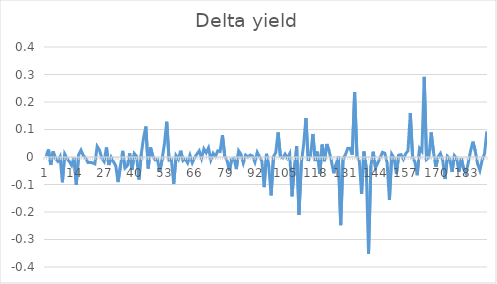
| Category | Series 0 |
|---|---|
| 0 | 0.004 |
| 1900-01-01 | 0.027 |
| 1900-01-02 | -0.029 |
| 1900-01-03 | 0.02 |
| 1900-01-04 | -0.005 |
| 1900-01-05 | -0.015 |
| 1900-01-06 | 0.001 |
| 1900-01-07 | -0.092 |
| 1900-01-08 | 0.01 |
| 1900-01-09 | -0.006 |
| 1900-01-10 | -0.016 |
| 1900-01-11 | -0.03 |
| 1900-01-12 | -0.002 |
| 1900-01-13 | -0.1 |
| 1900-01-14 | 0.008 |
| 1900-01-15 | 0.025 |
| 1900-01-16 | 0.006 |
| 1900-01-17 | -0.003 |
| 1900-01-18 | -0.02 |
| 1900-01-19 | -0.019 |
| 1900-01-20 | -0.021 |
| 1900-01-21 | -0.025 |
| 1900-01-22 | 0.039 |
| 1900-01-23 | 0.025 |
| 1900-01-24 | -0.004 |
| 1900-01-25 | -0.016 |
| 1900-01-26 | 0.035 |
| 1900-01-27 | -0.029 |
| 1900-01-28 | -0.001 |
| 1900-01-29 | -0.017 |
| 1900-01-30 | -0.032 |
| 1900-01-31 | -0.091 |
| 1900-02-01 | -0.035 |
| 1900-02-02 | 0.022 |
| 1900-02-03 | -0.04 |
| 1900-02-04 | -0.032 |
| 1900-02-05 | 0.013 |
| 1900-02-06 | -0.047 |
| 1900-02-07 | 0.013 |
| 1900-02-08 | 0.002 |
| 1900-02-09 | -0.082 |
| 1900-02-10 | 0.011 |
| 1900-02-11 | 0.07 |
| 1900-02-12 | 0.111 |
| 1900-02-13 | -0.042 |
| 1900-02-14 | 0.035 |
| 1900-02-15 | 0.002 |
| 1900-02-16 | -0.011 |
| 1900-02-17 | -0.009 |
| 1900-02-18 | -0.054 |
| 1900-02-19 | -0.008 |
| 1900-02-20 | 0.048 |
| 1900-02-21 | 0.128 |
| 1900-02-22 | -0.011 |
| 1900-02-23 | -0.009 |
| 1900-02-24 | -0.098 |
| 1900-02-25 | 0.005 |
| 1900-02-26 | -0.008 |
| 1900-02-27 | 0.023 |
| 1900-02-28 | -0.013 |
| 1900-02-28 | -0.006 |
| 1900-03-01 | -0.021 |
| 1900-03-02 | 0.006 |
| 1900-03-03 | -0.021 |
| 1900-03-04 | -0.002 |
| 1900-03-05 | 0.011 |
| 1900-03-06 | 0.022 |
| 1900-03-07 | -0.005 |
| 1900-03-08 | 0.03 |
| 1900-03-09 | 0.015 |
| 1900-03-10 | 0.033 |
| 1900-03-11 | -0.01 |
| 1900-03-12 | 0.013 |
| 1900-03-13 | 0.002 |
| 1900-03-14 | 0.022 |
| 1900-03-15 | 0.02 |
| 1900-03-16 | 0.079 |
| 1900-03-17 | 0.003 |
| 1900-03-18 | -0.013 |
| 1900-03-19 | -0.051 |
| 1900-03-20 | -0.008 |
| 1900-03-21 | -0.004 |
| 1900-03-22 | -0.044 |
| 1900-03-23 | 0.022 |
| 1900-03-24 | 0.01 |
| 1900-03-25 | -0.022 |
| 1900-03-26 | 0.007 |
| 1900-03-27 | 0 |
| 1900-03-28 | 0.007 |
| 1900-03-29 | 0.003 |
| 1900-03-30 | -0.019 |
| 1900-03-31 | 0.017 |
| 1900-04-01 | 0.001 |
| 1900-04-02 | -0.015 |
| 1900-04-03 | -0.11 |
| 1900-04-04 | 0.012 |
| 1900-04-05 | -0.035 |
| 1900-04-06 | -0.139 |
| 1900-04-07 | 0.001 |
| 1900-04-08 | 0.016 |
| 1900-04-09 | 0.089 |
| 1900-04-10 | 0.002 |
| 1900-04-11 | -0.004 |
| 1900-04-12 | 0.01 |
| 1900-04-13 | -0.004 |
| 1900-04-14 | 0.012 |
| 1900-04-15 | -0.143 |
| 1900-04-16 | -0.038 |
| 1900-04-17 | 0.04 |
| 1900-04-18 | -0.211 |
| 1900-04-19 | -0.023 |
| 1900-04-20 | 0.044 |
| 1900-04-21 | 0.142 |
| 1900-04-22 | -0.014 |
| 1900-04-23 | 0.007 |
| 1900-04-24 | 0.084 |
| 1900-04-25 | -0.015 |
| 1900-04-26 | 0.02 |
| 1900-04-27 | -0.062 |
| 1900-04-28 | 0.045 |
| 1900-04-29 | -0.015 |
| 1900-04-30 | 0.047 |
| 1900-05-01 | 0.022 |
| 1900-05-02 | -0.016 |
| 1900-05-03 | -0.059 |
| 1900-05-04 | -0.027 |
| 1900-05-05 | 0.002 |
| 1900-05-06 | -0.248 |
| 1900-05-07 | -0.005 |
| 1900-05-08 | 0.008 |
| 1900-05-09 | 0.032 |
| 1900-05-10 | 0.032 |
| 1900-05-11 | 0.008 |
| 1900-05-12 | 0.235 |
| 1900-05-13 | 0.003 |
| 1900-05-14 | -0.014 |
| 1900-05-15 | -0.134 |
| 1900-05-16 | 0.02 |
| 1900-05-17 | -0.039 |
| 1900-05-18 | -0.352 |
| 1900-05-19 | -0.032 |
| 1900-05-20 | 0.019 |
| 1900-05-21 | -0.039 |
| 1900-05-22 | -0.022 |
| 1900-05-23 | -0.003 |
| 1900-05-24 | 0.017 |
| 1900-05-25 | 0.014 |
| 1900-05-26 | -0.021 |
| 1900-05-27 | -0.156 |
| 1900-05-28 | 0.011 |
| 1900-05-29 | -0.003 |
| 1900-05-30 | -0.062 |
| 1900-05-31 | 0.007 |
| 1900-06-01 | 0.009 |
| 1900-06-02 | -0.008 |
| 1900-06-03 | 0.012 |
| 1900-06-04 | 0.023 |
| 1900-06-05 | 0.159 |
| 1900-06-06 | -0.001 |
| 1900-06-07 | -0.018 |
| 1900-06-08 | -0.066 |
| 1900-06-09 | 0.032 |
| 1900-06-10 | 0.021 |
| 1900-06-11 | 0.291 |
| 1900-06-12 | -0.009 |
| 1900-06-13 | -0.002 |
| 1900-06-14 | 0.089 |
| 1900-06-15 | 0.018 |
| 1900-06-16 | -0.035 |
| 1900-06-17 | 0.001 |
| 1900-06-18 | 0.013 |
| 1900-06-19 | -0.013 |
| 1900-06-20 | -0.08 |
| 1900-06-21 | 0.003 |
| 1900-06-22 | -0.005 |
| 1900-06-23 | -0.054 |
| 1900-06-24 | 0.005 |
| 1900-06-25 | -0.005 |
| 1900-06-26 | -0.054 |
| 1900-06-27 | -0.004 |
| 1900-06-28 | -0.043 |
| 1900-06-29 | -0.059 |
| 1900-06-30 | -0.021 |
| 1900-07-01 | 0.023 |
| 1900-07-02 | 0.056 |
| 1900-07-03 | 0.022 |
| 1900-07-04 | -0.025 |
| 1900-07-05 | -0.049 |
| 1900-07-06 | -0.01 |
| 1900-07-07 | 0.011 |
| 1900-07-08 | 0.093 |